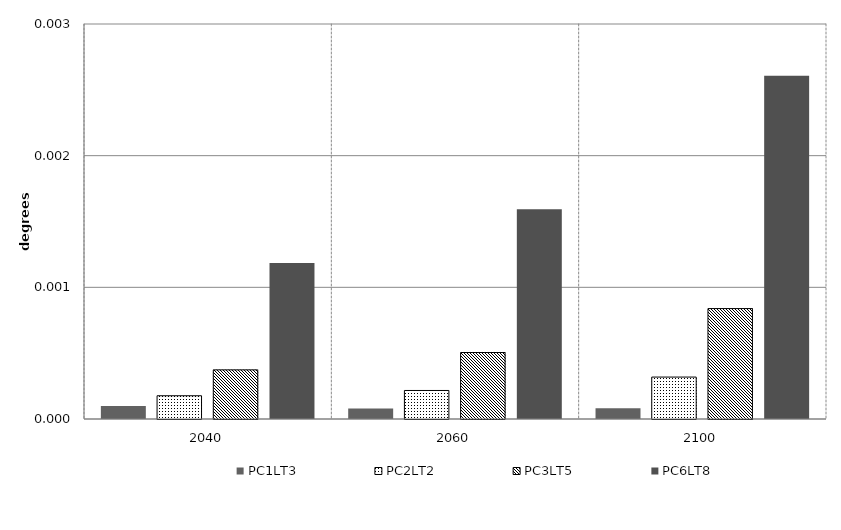
| Category | PC1LT3 | PC2LT2 | PC3LT5 | PC6LT8 | Alt 5 | Alt 6 | Alt 7 | Alt 8 | Alt 10 |
|---|---|---|---|---|---|---|---|---|---|
| 2040.0 | 0 | 0 | 0 | 0.001 |  |  |  |  |  |
| 2060.0 | 0 | 0 | 0.001 | 0.002 |  |  |  |  |  |
| 2100.0 | 0 | 0 | 0.001 | 0.003 |  |  |  |  |  |